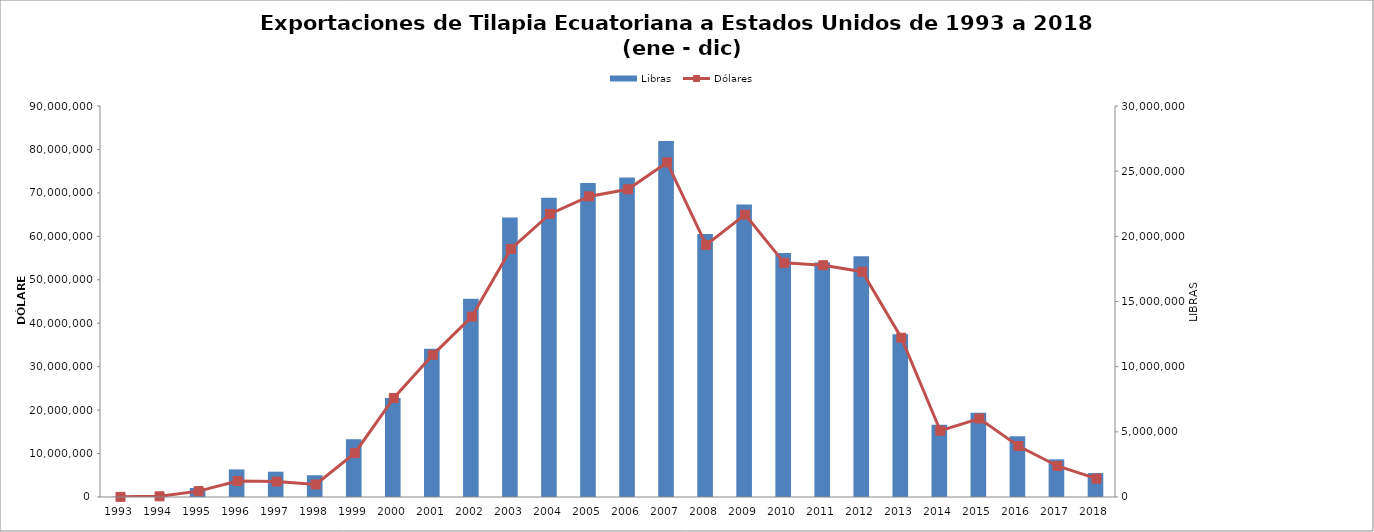
| Category | Libras |
|---|---|
| 1993.0 | 21730.742 |
| 1994.0 | 88499.258 |
| 1995.0 | 689457.786 |
| 1996.0 | 2116647.483 |
| 1997.0 | 1941708.064 |
| 1998.0 | 1668547.101 |
| 1999.0 | 4434656.516 |
| 2000.0 | 7599686.097 |
| 2001.0 | 11373890.75 |
| 2002.0 | 15219326.029 |
| 2003.0 | 21443302.043 |
| 2004.0 | 22953708.776 |
| 2005.0 | 24101028.913 |
| 2006.0 | 24512713.712 |
| 2007.0 | 27315395.237 |
| 2008.0 | 20170218.295 |
| 2009.0 | 22438586.35 |
| 2010.0 | 18724421.773 |
| 2011.0 | 17995543.535 |
| 2012.0 | 18477544.051 |
| 2013.0 | 12494087.693 |
| 2014.0 | 5552509.969 |
| 2015.0 | 6465454.516 |
| 2016.0 | 4663040.341 |
| 2017.0 | 2890376.104 |
| 2018.0 | 1835184.029 |